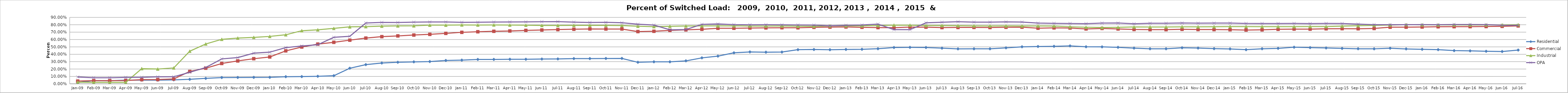
| Category | Residential | Commercial | Industrial | OPA |
|---|---|---|---|---|
| 2009-01-01 | 0.016 | 0.037 | 0.022 | 0.092 |
| 2009-02-01 | 0.043 | 0.043 | 0.02 | 0.082 |
| 2009-03-01 | 0.041 | 0.042 | 0.02 | 0.082 |
| 2009-04-01 | 0.05 | 0.044 | 0.02 | 0.086 |
| 2009-05-01 | 0.049 | 0.056 | 0.206 | 0.087 |
| 2009-06-01 | 0.049 | 0.057 | 0.2 | 0.094 |
| 2009-07-01 | 0.053 | 0.066 | 0.215 | 0.095 |
| 2009-08-01 | 0.061 | 0.168 | 0.442 | 0.156 |
| 2009-09-01 | 0.073 | 0.211 | 0.539 | 0.221 |
| 2009-10-01 | 0.085 | 0.275 | 0.603 | 0.338 |
| 2009-11-01 | 0.086 | 0.31 | 0.619 | 0.356 |
| 2009-12-01 | 0.087 | 0.34 | 0.629 | 0.415 |
| 2010-01-01 | 0.088 | 0.364 | 0.642 | 0.429 |
| 2010-02-01 | 0.096 | 0.446 | 0.664 | 0.49 |
| 2010-03-01 | 0.098 | 0.499 | 0.719 | 0.512 |
| 2010-04-01 | 0.102 | 0.538 | 0.732 | 0.529 |
| 2010-05-01 | 0.109 | 0.562 | 0.751 | 0.63 |
| 2010-06-01 | 0.211 | 0.591 | 0.771 | 0.644 |
| 2010-07-01 | 0.26 | 0.62 | 0.774 | 0.824 |
| 2010-08-01 | 0.282 | 0.639 | 0.781 | 0.832 |
| 2010-09-01 | 0.292 | 0.649 | 0.784 | 0.831 |
| 2010-10-01 | 0.297 | 0.661 | 0.786 | 0.835 |
| 2010-11-01 | 0.301 | 0.67 | 0.795 | 0.837 |
| 2010-12-01 | 0.316 | 0.683 | 0.794 | 0.838 |
| 2011-01-01 | 0.321 | 0.698 | 0.797 | 0.834 |
| 2011-02-01 | 0.33 | 0.705 | 0.796 | 0.834 |
| 2011-03-01 | 0.33 | 0.712 | 0.797 | 0.836 |
| 2011-04-01 | 0.332 | 0.716 | 0.796 | 0.838 |
| 2011-05-01 | 0.332 | 0.724 | 0.794 | 0.838 |
| 2011-06-01 | 0.335 | 0.729 | 0.79 | 0.841 |
| 2011-07-01 | 0.337 | 0.735 | 0.79 | 0.842 |
| 2011-08-01 | 0.342 | 0.739 | 0.792 | 0.836 |
| 2011-09-01 | 0.342 | 0.743 | 0.792 | 0.831 |
| 2011-10-01 | 0.343 | 0.742 | 0.792 | 0.832 |
| 2011-11-01 | 0.344 | 0.742 | 0.789 | 0.827 |
| 2011-12-01 | 0.292 | 0.708 | 0.78 | 0.807 |
| 2012-01-01 | 0.298 | 0.712 | 0.775 | 0.796 |
| 2012-02-01 | 0.298 | 0.723 | 0.779 | 0.732 |
| 2012-03-01 | 0.311 | 0.731 | 0.783 | 0.735 |
| 2012-04-01 | 0.351 | 0.738 | 0.785 | 0.806 |
| 2012-05-01 | 0.375 | 0.752 | 0.785 | 0.811 |
| 2012-06-01 | 0.42 | 0.752 | 0.786 | 0.802 |
| 2012-07-01 | 0.432 | 0.756 | 0.782 | 0.8 |
| 2012-08-01 | 0.428 | 0.758 | 0.783 | 0.801 |
| 2012-09-01 | 0.43 | 0.76 | 0.783 | 0.799 |
| 2012-10-01 | 0.463 | 0.759 | 0.78 | 0.798 |
| 2012-11-01 | 0.464 | 0.765 | 0.779 | 0.796 |
| 2012-12-01 | 0.461 | 0.768 | 0.785 | 0.786 |
| 2013-01-01 | 0.465 | 0.77 | 0.786 | 0.793 |
| 2013-02-01 | 0.467 | 0.765 | 0.786 | 0.797 |
| 2013-03-01 | 0.475 | 0.761 | 0.79 | 0.808 |
| 2013-04-01 | 0.492 | 0.76 | 0.795 | 0.734 |
| 2013-05-01 | 0.494 | 0.768 | 0.794 | 0.734 |
| 2013-06-01 | 0.492 | 0.768 | 0.789 | 0.826 |
| 2013-07-01 | 0.483 | 0.761 | 0.79 | 0.834 |
| 2013-08-01 | 0.473 | 0.763 | 0.787 | 0.841 |
| 2013-09-01 | 0.474 | 0.764 | 0.785 | 0.836 |
| 2013-10-01 | 0.474 | 0.763 | 0.784 | 0.835 |
| 2013-11-01 | 0.487 | 0.766 | 0.784 | 0.839 |
| 2013-12-01 | 0.501 | 0.768 | 0.783 | 0.837 |
| 2014-01-01 | 0.505 | 0.753 | 0.783 | 0.822 |
| 2014-02-01 | 0.508 | 0.758 | 0.783 | 0.82 |
| 2014-03-01 | 0.514 | 0.756 | 0.772 | 0.817 |
| 2014-04-01 | 0.502 | 0.743 | 0.767 | 0.815 |
| 2014-05-01 | 0.5 | 0.75 | 0.762 | 0.823 |
| 2014-06-01 | 0.494 | 0.743 | 0.765 | 0.824 |
| 2014-07-01 | 0.484 | 0.736 | 0.77 | 0.814 |
| 2014-08-01 | 0.474 | 0.734 | 0.77 | 0.82 |
| 2014-09-01 | 0.474 | 0.734 | 0.77 | 0.82 |
| 2014-10-01 | 0.488 | 0.738 | 0.772 | 0.824 |
| 2014-11-01 | 0.484 | 0.735 | 0.772 | 0.822 |
| 2014-12-01 | 0.476 | 0.735 | 0.773 | 0.822 |
| 2015-01-01 | 0.472 | 0.732 | 0.776 | 0.823 |
| 2015-02-01 | 0.462 | 0.729 | 0.775 | 0.818 |
| 2015-03-01 | 0.474 | 0.731 | 0.774 | 0.817 |
| 2015-04-01 | 0.48 | 0.738 | 0.774 | 0.817 |
| 2015-05-01 | 0.496 | 0.741 | 0.774 | 0.818 |
| 2015-06-01 | 0.491 | 0.741 | 0.776 | 0.815 |
| 2015-07-01 | 0.486 | 0.745 | 0.775 | 0.818 |
| 2015-08-01 | 0.48 | 0.747 | 0.782 | 0.817 |
| 2015-09-01 | 0.475 | 0.746 | 0.787 | 0.809 |
| 2015-10-01 | 0.474 | 0.749 | 0.792 | 0.801 |
| 2015-11-01 | 0.482 | 0.767 | 0.796 | 0.801 |
| 2015-12-01 | 0.472 | 0.768 | 0.802 | 0.801 |
| 2016-01-01 | 0.467 | 0.769 | 0.8 | 0.802 |
| 2016-02-01 | 0.462 | 0.773 | 0.799 | 0.8 |
| 2016-03-01 | 0.449 | 0.774 | 0.799 | 0.803 |
| 2016-04-01 | 0.446 | 0.774 | 0.798 | 0.803 |
| 2016-05-01 | 0.441 | 0.776 | 0.798 | 0.802 |
| 2016-06-01 | 0.437 | 0.778 | 0.799 | 0.794 |
| 2016-07-01 | 0.457 | 0.784 | 0.801 | 0.792 |